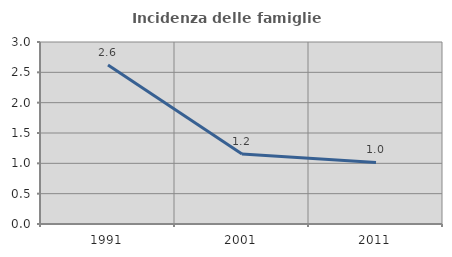
| Category | Incidenza delle famiglie numerose |
|---|---|
| 1991.0 | 2.622 |
| 2001.0 | 1.154 |
| 2011.0 | 1.015 |